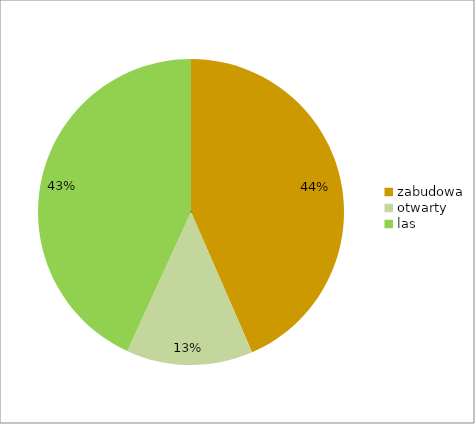
| Category | Series 0 |
|---|---|
| zabudowa | 0.435 |
| otwarty | 0.134 |
| las | 0.432 |